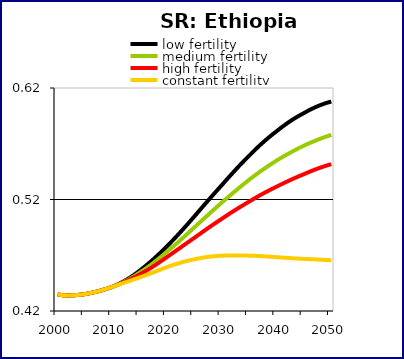
| Category | low fertility | medium fertility | high fertility | constant fertility |
|---|---|---|---|---|
| 2000.0 | 0.435 | 0.435 | 0.435 | 0.435 |
| 2001.0 | 0.434 | 0.434 | 0.434 | 0.434 |
| 2002.0 | 0.434 | 0.434 | 0.434 | 0.434 |
| 2003.0 | 0.434 | 0.434 | 0.434 | 0.434 |
| 2004.0 | 0.435 | 0.435 | 0.435 | 0.435 |
| 2005.0 | 0.435 | 0.435 | 0.435 | 0.435 |
| 2006.0 | 0.436 | 0.436 | 0.436 | 0.436 |
| 2007.0 | 0.437 | 0.437 | 0.437 | 0.437 |
| 2008.0 | 0.439 | 0.439 | 0.439 | 0.439 |
| 2009.0 | 0.44 | 0.44 | 0.44 | 0.44 |
| 2010.0 | 0.442 | 0.442 | 0.442 | 0.442 |
| 2011.0 | 0.444 | 0.444 | 0.444 | 0.443 |
| 2012.0 | 0.446 | 0.446 | 0.446 | 0.445 |
| 2013.0 | 0.449 | 0.448 | 0.448 | 0.447 |
| 2014.0 | 0.453 | 0.451 | 0.45 | 0.448 |
| 2015.0 | 0.456 | 0.455 | 0.453 | 0.45 |
| 2016.0 | 0.46 | 0.458 | 0.456 | 0.452 |
| 2017.0 | 0.464 | 0.461 | 0.459 | 0.454 |
| 2018.0 | 0.469 | 0.465 | 0.462 | 0.456 |
| 2019.0 | 0.473 | 0.469 | 0.465 | 0.458 |
| 2020.0 | 0.478 | 0.473 | 0.468 | 0.459 |
| 2021.0 | 0.483 | 0.477 | 0.472 | 0.461 |
| 2022.0 | 0.488 | 0.482 | 0.475 | 0.463 |
| 2023.0 | 0.494 | 0.486 | 0.479 | 0.464 |
| 2024.0 | 0.499 | 0.491 | 0.482 | 0.465 |
| 2025.0 | 0.505 | 0.495 | 0.486 | 0.466 |
| 2026.0 | 0.511 | 0.5 | 0.489 | 0.467 |
| 2027.0 | 0.516 | 0.504 | 0.493 | 0.468 |
| 2028.0 | 0.522 | 0.509 | 0.496 | 0.469 |
| 2029.0 | 0.528 | 0.513 | 0.499 | 0.469 |
| 2030.0 | 0.533 | 0.517 | 0.503 | 0.47 |
| 2031.0 | 0.538 | 0.522 | 0.506 | 0.47 |
| 2032.0 | 0.544 | 0.526 | 0.509 | 0.47 |
| 2033.0 | 0.549 | 0.53 | 0.512 | 0.47 |
| 2034.0 | 0.554 | 0.534 | 0.515 | 0.47 |
| 2035.0 | 0.559 | 0.538 | 0.518 | 0.47 |
| 2036.0 | 0.564 | 0.541 | 0.521 | 0.47 |
| 2037.0 | 0.569 | 0.545 | 0.524 | 0.469 |
| 2038.0 | 0.573 | 0.548 | 0.527 | 0.469 |
| 2039.0 | 0.577 | 0.552 | 0.529 | 0.469 |
| 2040.0 | 0.581 | 0.555 | 0.532 | 0.468 |
| 2041.0 | 0.585 | 0.558 | 0.534 | 0.468 |
| 2042.0 | 0.589 | 0.561 | 0.536 | 0.468 |
| 2043.0 | 0.592 | 0.563 | 0.539 | 0.467 |
| 2044.0 | 0.595 | 0.566 | 0.541 | 0.467 |
| 2045.0 | 0.598 | 0.568 | 0.543 | 0.467 |
| 2046.0 | 0.6 | 0.571 | 0.545 | 0.466 |
| 2047.0 | 0.603 | 0.573 | 0.547 | 0.466 |
| 2048.0 | 0.605 | 0.575 | 0.549 | 0.466 |
| 2049.0 | 0.606 | 0.576 | 0.55 | 0.466 |
| 2050.0 | 0.608 | 0.578 | 0.552 | 0.466 |